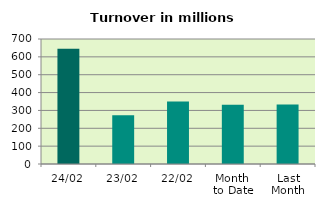
| Category | Series 0 |
|---|---|
| 24/02 | 645.875 |
| 23/02 | 273.499 |
| 22/02 | 350.292 |
| Month 
to Date | 332.398 |
| Last
Month | 332.646 |